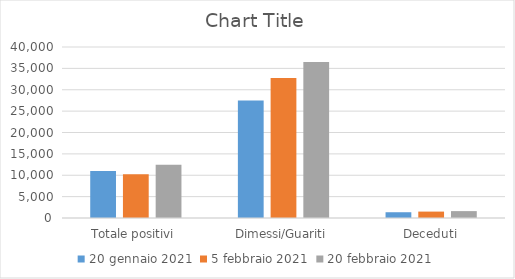
| Category | 20 gennaio 2021 | 5 febbraio 2021 | 20 febbraio 2021 |
|---|---|---|---|
| Totale positivi | 10987 | 10226 | 12483 |
| Dimessi/Guariti | 27478 | 32740 | 36497 |
| Deceduti | 1349 | 1498 | 1610 |